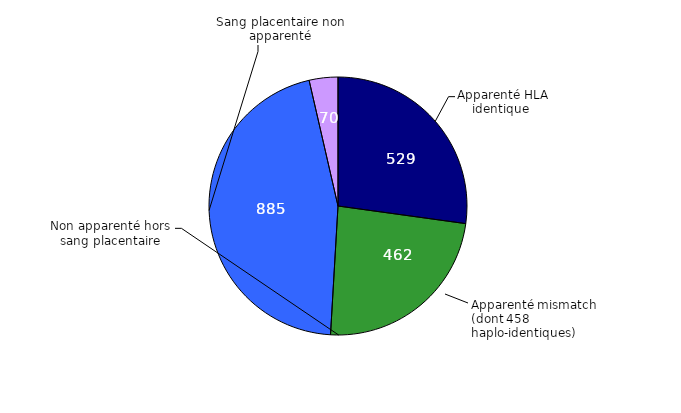
| Category | Nombre | Pourcentage |
|---|---|---|
| Apparenté HLA identique | 529 | 0.272 |
| Apparenté mismatch | 462 | 0.237 |
| Non apparenté (hors sang placentaire) | 885 | 0.455 |
| Sang placentaire non apparenté | 70 | 0.036 |